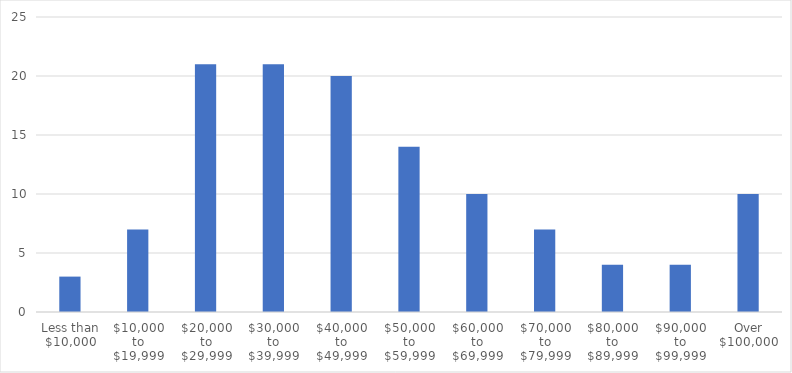
| Category | Number of Responses |
|---|---|
| Less than $10,000 | 3 |
| $10,000 to $19,999 | 7 |
| $20,000 to $29,999 | 21 |
| $30,000 to $39,999 | 21 |
| $40,000 to $49,999 | 20 |
| $50,000 to $59,999 | 14 |
| $60,000 to $69,999 | 10 |
| $70,000 to $79,999 | 7 |
| $80,000 to $89,999 | 4 |
| $90,000 to $99,999 | 4 |
| Over $100,000 | 10 |